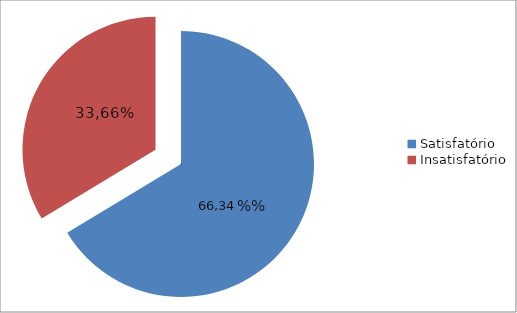
| Category | Series 0 |
|---|---|
| Satisfatório | 0.663 |
| Insatisfatório | 0.337 |